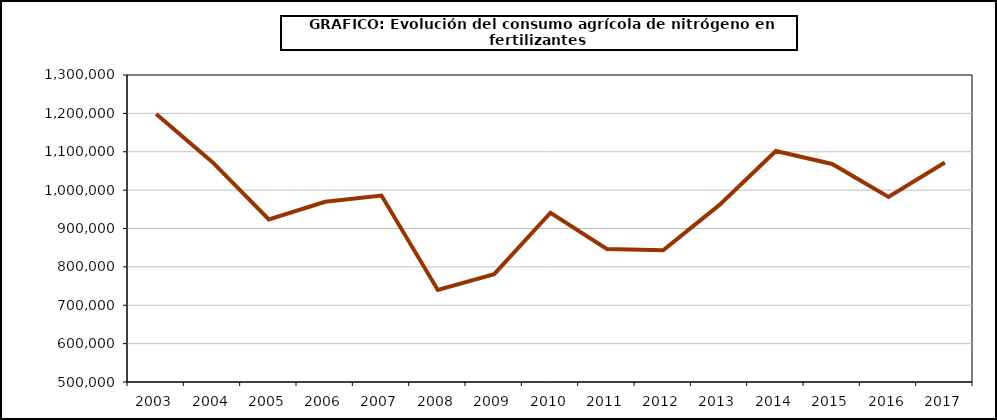
| Category | fertilizantes |
|---|---|
| 2003.0 | 1198606 |
| 2004.0 | 1072949 |
| 2005.0 | 923764 |
| 2006.0 | 969783 |
| 2007.0 | 985857 |
| 2008.0 | 739757 |
| 2009.0 | 781069 |
| 2010.0 | 940984 |
| 2011.0 | 846697 |
| 2012.0 | 843410 |
| 2013.0 | 961507 |
| 2014.0 | 1101895 |
| 2015.0 | 1068103 |
| 2016.0 | 982155 |
| 2017.0 | 1072125 |